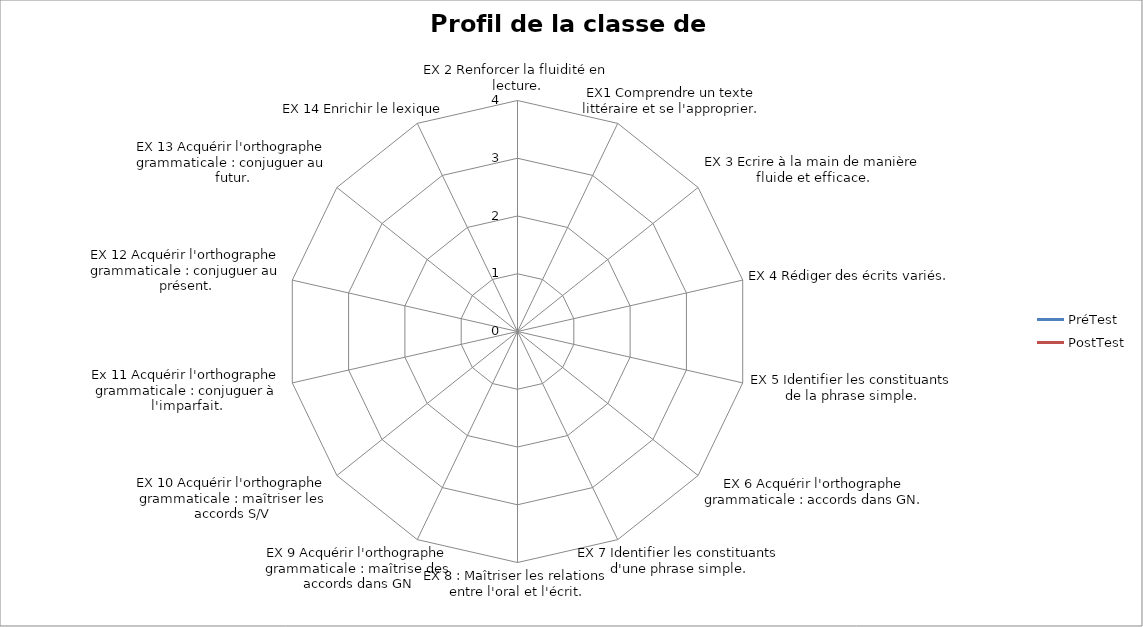
| Category | PréTest | PostTest |
|---|---|---|
| EX 2 Renforcer la fluidité en lecture. | 0 | 0 |
| EX1 Comprendre un texte littéraire et se l'approprier. | 0 | 0 |
| EX 3 Ecrire à la main de manière fluide et efficace. | 0 | 0 |
| EX 4 Rédiger des écrits variés. | 0 | 0 |
| EX 5 Identifier les constituants de la phrase simple. | 0 | 0 |
| EX 6 Acquérir l'orthographe grammaticale : accords dans GN. | 0 | 0 |
| EX 7 Identifier les constituants d'une phrase simple. | 0 | 0 |
| EX 8 : Maîtriser les relations entre l'oral et l'écrit. | 0 | 0 |
| EX 9 Acquérir l'orthographe grammaticale : maîtrise des accords dans GN | 0 | 0 |
| EX 10 Acquérir l'orthographe grammaticale : maîtriser les accords S/V | 0 | 0 |
| Ex 11 Acquérir l'orthographe grammaticale : conjuguer à l'imparfait. | 0 | 0 |
| EX 12 Acquérir l'orthographe grammaticale : conjuguer au présent. | 0 | 0 |
| EX 13 Acquérir l'orthographe grammaticale : conjuguer au futur. | 0 | 0 |
| EX 14 Enrichir le lexique | 0 | 0 |